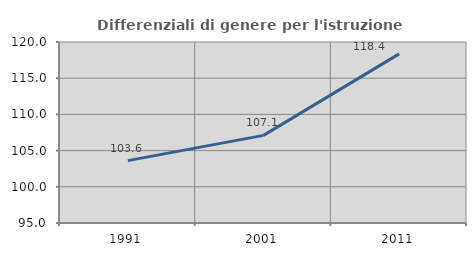
| Category | Differenziali di genere per l'istruzione superiore |
|---|---|
| 1991.0 | 103.616 |
| 2001.0 | 107.106 |
| 2011.0 | 118.361 |